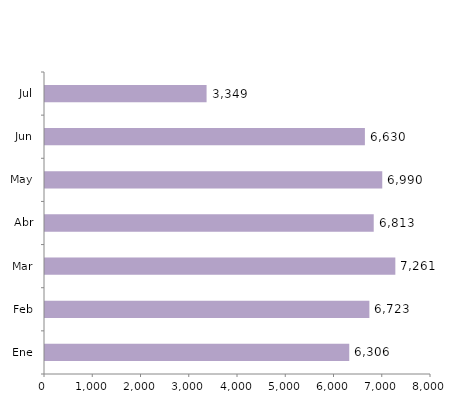
| Category | Series 0 |
|---|---|
| Ene | 6306 |
| Feb | 6723 |
| Mar | 7261 |
| Abr | 6813 |
| May | 6990 |
| Jun | 6630 |
| Jul | 3349 |